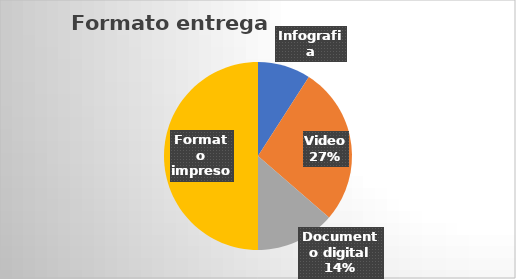
| Category | Series 0 |
|---|---|
| Infografia | 2 |
| Video | 6 |
| Documento digital | 3 |
| Formato impreso | 11 |